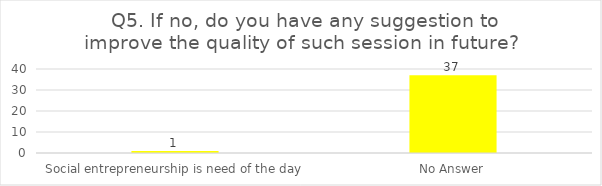
| Category | Q5. If no, do you have any suggestion to improve the quality of such session in future?  |
|---|---|
| Social entrepreneurship is need of the day | 1 |
| No Answer | 37 |